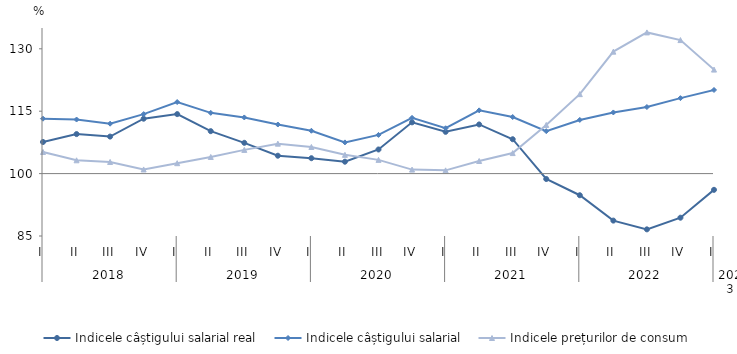
| Category | Indicele câștigului salarial real | Indicele câștigului salarial | Indicele prețurilor de consum |
|---|---|---|---|
| 0 | 107.6 | 113.2 | 105.2 |
| 1 | 109.5 | 113 | 103.2 |
| 2 | 108.9 | 112 | 102.8 |
| 3 | 113.2 | 114.3 | 101 |
| 4 | 114.3 | 117.2 | 102.5 |
| 5 | 110.2 | 114.6 | 104 |
| 6 | 107.4 | 113.5 | 105.7 |
| 7 | 104.3 | 111.8 | 107.2 |
| 8 | 103.7 | 110.3 | 106.4 |
| 9 | 102.861 | 107.5 | 104.51 |
| 10 | 105.8 | 109.3 | 103.3 |
| 11 | 112.322 | 113.4 | 100.96 |
| 12 | 110.042 | 110.9 | 100.78 |
| 13 | 111.816 | 115.2 | 103.026 |
| 14 | 108.263 | 113.6 | 104.93 |
| 15 | 98.7 | 110.2 | 111.7 |
| 16 | 94.8 | 112.9 | 119.1 |
| 17 | 88.7 | 114.7 | 129.32 |
| 18 | 86.6 | 116 | 133.938 |
| 19 | 89.4 | 118.136 | 132.1 |
| 20 | 96.1 | 120.1 | 125 |